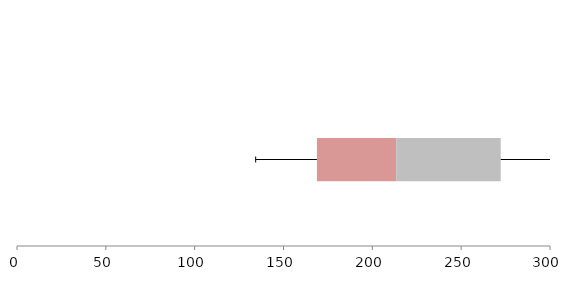
| Category | Series 1 | Series 2 | Series 3 |
|---|---|---|---|
| 0 | 168.814 | 44.654 | 58.795 |